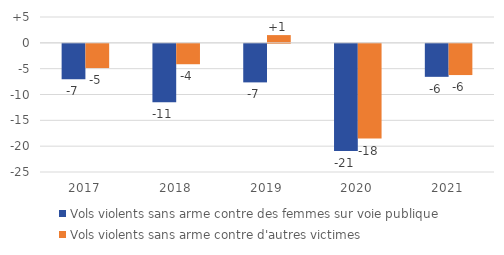
| Category | Vols violents sans arme contre des femmes sur voie publique | Vols violents sans arme contre d'autres victimes |
|---|---|---|
| 2017.0 | -6.832 | -4.692 |
| 2018.0 | -11.315 | -3.947 |
| 2019.0 | -7.462 | 1.498 |
| 2020.0 | -20.753 | -18.327 |
| 2021.0 | -6.388 | -6.043 |